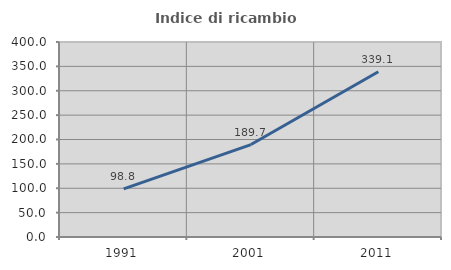
| Category | Indice di ricambio occupazionale  |
|---|---|
| 1991.0 | 98.83 |
| 2001.0 | 189.655 |
| 2011.0 | 339.08 |